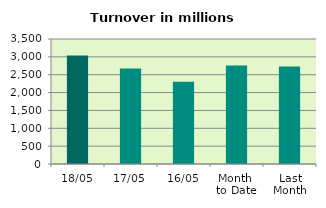
| Category | Series 0 |
|---|---|
| 18/05 | 3040.415 |
| 17/05 | 2672.62 |
| 16/05 | 2305.409 |
| Month 
to Date | 2758.359 |
| Last
Month | 2727.753 |